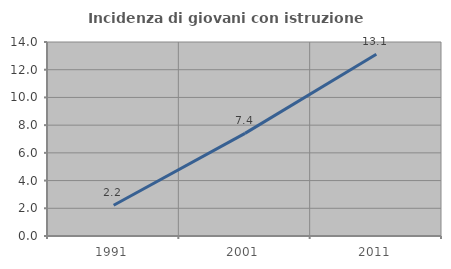
| Category | Incidenza di giovani con istruzione universitaria |
|---|---|
| 1991.0 | 2.222 |
| 2001.0 | 7.407 |
| 2011.0 | 13.115 |